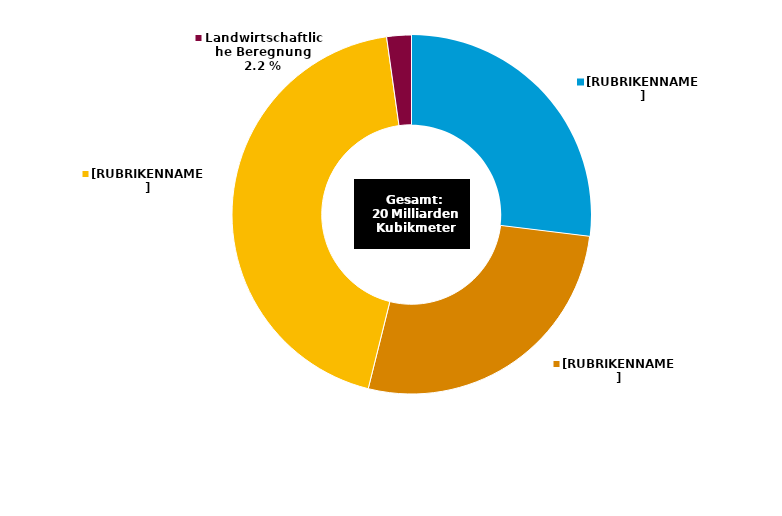
| Category | 2019 |
|---|---|
| Öffentliche Wasserversorgung | 5.4 |
| Bergbau und verarbeitendes Gewerbe | 5.4 |
| Energieversorgung | 8.8 |
| Landwirtschaftliche Beregnung | 0.445 |